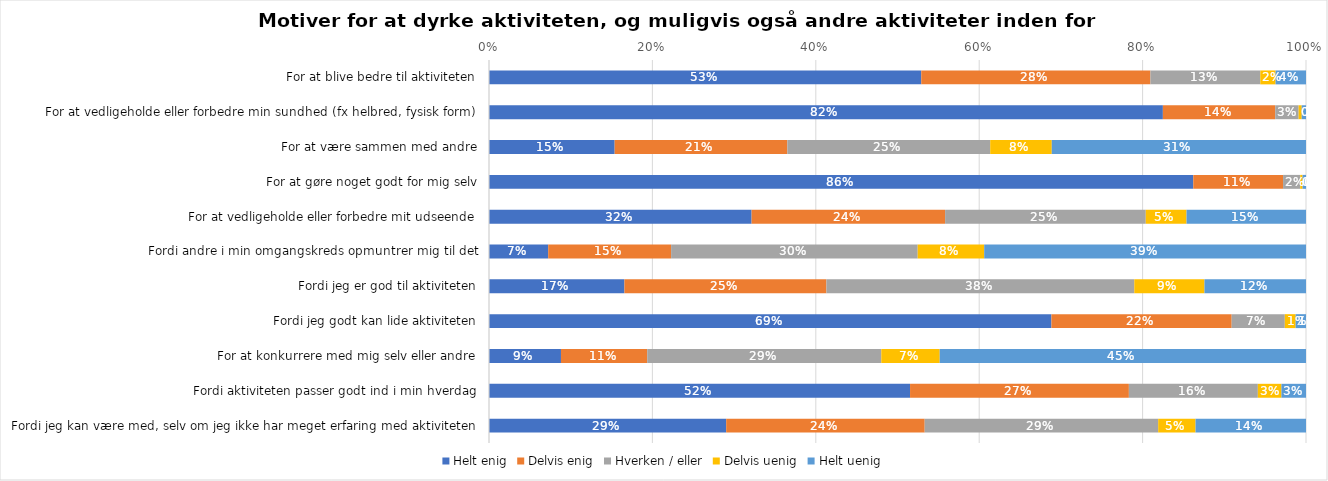
| Category | Helt enig | Delvis enig | Hverken / eller | Delvis uenig | Helt uenig |
|---|---|---|---|---|---|
| For at blive bedre til aktiviteten | 0.529 | 0.281 | 0.135 | 0.019 | 0.037 |
| For at vedligeholde eller forbedre min sundhed (fx helbred, fysisk form) | 0.825 | 0.138 | 0.029 | 0.004 | 0.005 |
| For at være sammen med andre | 0.154 | 0.211 | 0.248 | 0.075 | 0.311 |
| For at gøre noget godt for mig selv | 0.862 | 0.11 | 0.021 | 0.003 | 0.004 |
| For at vedligeholde eller forbedre mit udseende | 0.321 | 0.237 | 0.246 | 0.05 | 0.146 |
| Fordi andre i min omgangskreds opmuntrer mig til det | 0.072 | 0.15 | 0.302 | 0.081 | 0.394 |
| Fordi jeg er god til aktiviteten | 0.166 | 0.247 | 0.377 | 0.086 | 0.124 |
| Fordi jeg godt kan lide aktiviteten | 0.688 | 0.221 | 0.065 | 0.013 | 0.013 |
| For at konkurrere med mig selv eller andre | 0.088 | 0.106 | 0.286 | 0.072 | 0.448 |
| Fordi aktiviteten passer godt ind i min hverdag | 0.515 | 0.268 | 0.158 | 0.029 | 0.03 |
| Fordi jeg kan være med, selv om jeg ikke har meget erfaring med aktiviteten | 0.29 | 0.243 | 0.286 | 0.046 | 0.135 |